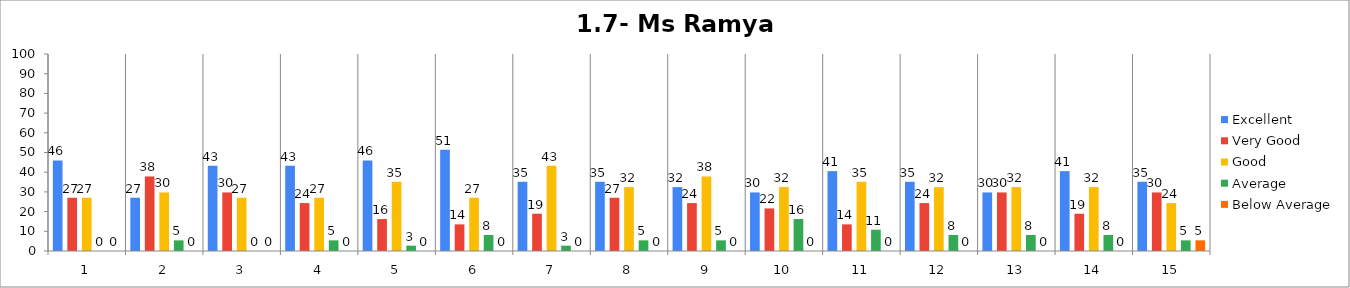
| Category | Excellent | Very Good | Good | Average | Below Average |
|---|---|---|---|---|---|
| 0 | 45.946 | 27.027 | 27.027 | 0 | 0 |
| 1 | 27.027 | 37.838 | 29.73 | 5.405 | 0 |
| 2 | 43.243 | 29.73 | 27.027 | 0 | 0 |
| 3 | 43.243 | 24.324 | 27.027 | 5.405 | 0 |
| 4 | 45.946 | 16.216 | 35.135 | 2.703 | 0 |
| 5 | 51.351 | 13.514 | 27.027 | 8.108 | 0 |
| 6 | 35.135 | 18.919 | 43.243 | 2.703 | 0 |
| 7 | 35.135 | 27.027 | 32.432 | 5.405 | 0 |
| 8 | 32.432 | 24.324 | 37.838 | 5.405 | 0 |
| 9 | 29.73 | 21.622 | 32.432 | 16.216 | 0 |
| 10 | 40.541 | 13.514 | 35.135 | 10.811 | 0 |
| 11 | 35.135 | 24.324 | 32.432 | 8.108 | 0 |
| 12 | 29.73 | 29.73 | 32.432 | 8.108 | 0 |
| 13 | 40.541 | 18.919 | 32.432 | 8.108 | 0 |
| 14 | 35.135 | 29.73 | 24.324 | 5.405 | 5.405 |